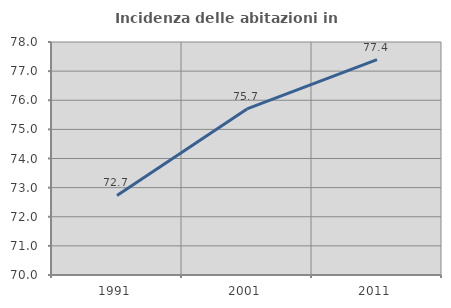
| Category | Incidenza delle abitazioni in proprietà  |
|---|---|
| 1991.0 | 72.733 |
| 2001.0 | 75.701 |
| 2011.0 | 77.392 |